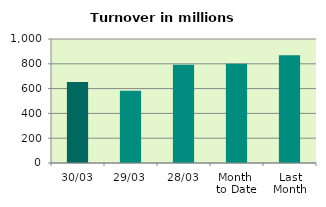
| Category | Series 0 |
|---|---|
| 30/03 | 653.635 |
| 29/03 | 583.318 |
| 28/03 | 792.849 |
| Month 
to Date | 800.753 |
| Last
Month | 868.35 |